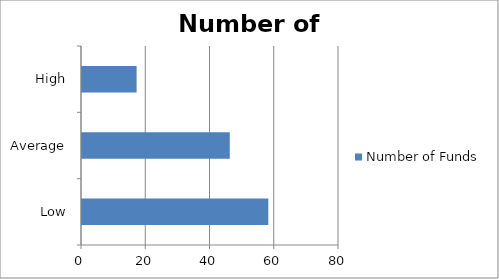
| Category | Number of Funds |
|---|---|
| Low | 58 |
| Average | 46 |
| High | 17 |